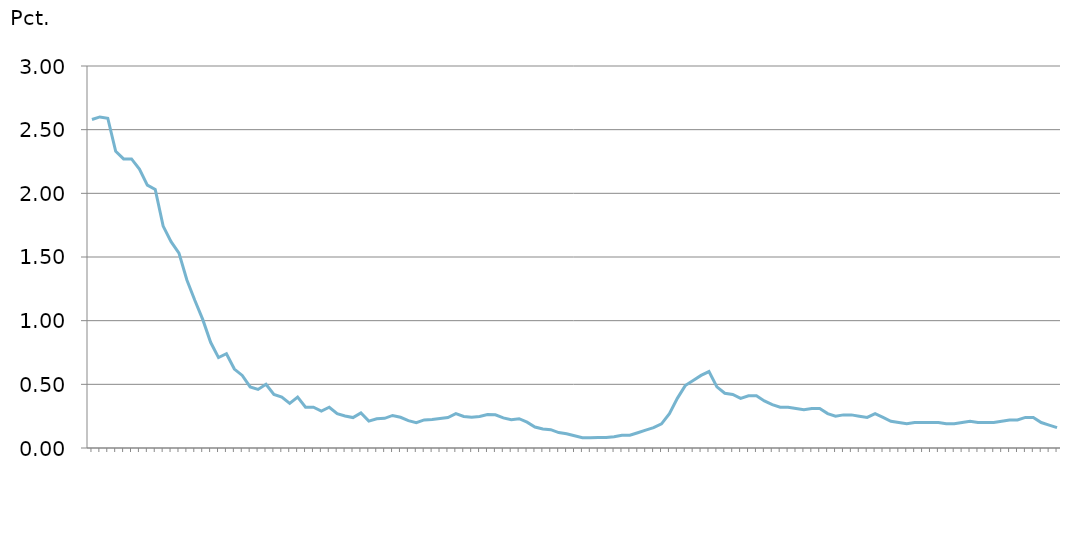
| Category | Restanceprocent |
|---|---|
| nan | 2.58 |
| nan | 2.6 |
| nan | 2.59 |
| 1991.0 | 2.33 |
| nan | 2.27 |
| nan | 2.27 |
| nan | 2.19 |
| 1992.0 | 2.064 |
| nan | 2.03 |
| nan | 1.743 |
| nan | 1.62 |
| 1993.0 | 1.53 |
| nan | 1.32 |
| nan | 1.16 |
| nan | 1.01 |
| 1994.0 | 0.83 |
| nan | 0.71 |
| nan | 0.74 |
| nan | 0.62 |
| 1995.0 | 0.57 |
| nan | 0.48 |
| nan | 0.46 |
| nan | 0.5 |
| 1996.0 | 0.42 |
| nan | 0.4 |
| nan | 0.35 |
| nan | 0.4 |
| 1997.0 | 0.32 |
| nan | 0.32 |
| nan | 0.29 |
| nan | 0.32 |
| 1998.0 | 0.269 |
| nan | 0.252 |
| nan | 0.239 |
| nan | 0.276 |
| 1999.0 | 0.211 |
| nan | 0.23 |
| nan | 0.233 |
| nan | 0.256 |
| 2000.0 | 0.241 |
| nan | 0.215 |
| nan | 0.199 |
| nan | 0.221 |
| 2001.0 | 0.224 |
| nan | 0.231 |
| nan | 0.239 |
| nan | 0.269 |
| 2002.0 | 0.247 |
| nan | 0.241 |
| nan | 0.248 |
| nan | 0.262 |
| 2003.0 | 0.261 |
| nan | 0.237 |
| nan | 0.223 |
| nan | 0.23 |
| 2004.0 | 0.203 |
| nan | 0.164 |
| nan | 0.149 |
| nan | 0.144 |
| 2005.0 | 0.121 |
| nan | 0.112 |
| nan | 0.097 |
| nan | 0.081 |
| 2006.0 | 0.08 |
| nan | 0.082 |
| nan | 0.082 |
| nan | 0.088 |
| 2007.0 | 0.1 |
| nan | 0.1 |
| nan | 0.12 |
| nan | 0.14 |
| 2008.0 | 0.16 |
| nan | 0.19 |
| nan | 0.27 |
| nan | 0.39 |
| 2009.0 | 0.49 |
| nan | 0.53 |
| nan | 0.57 |
| nan | 0.6 |
| 2010.0 | 0.48 |
| nan | 0.43 |
| nan | 0.42 |
| nan | 0.39 |
| 2011.0 | 0.41 |
| nan | 0.41 |
| nan | 0.37 |
| nan | 0.34 |
| 2012.0 | 0.32 |
| nan | 0.32 |
| nan | 0.31 |
| nan | 0.3 |
| 2013.0 | 0.31 |
| nan | 0.31 |
| nan | 0.27 |
| nan | 0.25 |
| 2014.0 | 0.26 |
| nan | 0.26 |
| nan | 0.25 |
| nan | 0.24 |
| 2015.0 | 0.27 |
| nan | 0.24 |
| nan | 0.21 |
| nan | 0.2 |
| 2016.0 | 0.19 |
| nan | 0.2 |
| nan | 0.2 |
| nan | 0.2 |
| 2017.0 | 0.2 |
| nan | 0.19 |
| nan | 0.19 |
| nan | 0.2 |
| 2018.0 | 0.21 |
| nan | 0.2 |
| nan | 0.2 |
| nan | 0.2 |
| 2019.0 | 0.21 |
| nan | 0.22 |
| nan | 0.22 |
| nan | 0.24 |
| 2020.0 | 0.24 |
| nan | 0.2 |
| nan | 0.18 |
| nan | 0.16 |